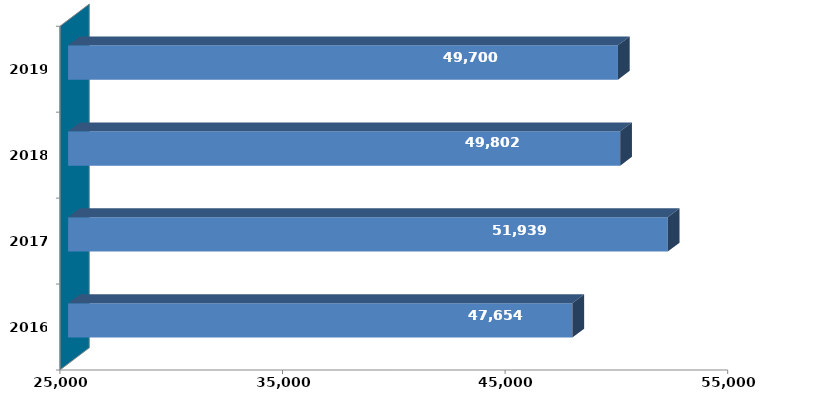
| Category |  Column2  |
|---|---|
| 2016 | 47653822 |
| 2017 | 51938940 |
| 2018 | 49801606 |
| 2019 | 49700163 |